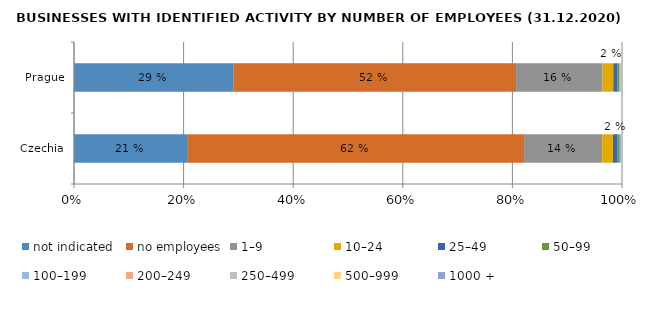
| Category | not indicated | no employees | 1–9 | 10–24 | 25–49 | 50–99 | 100–199 | 200–249 | 250–499 | 500–999 | 1000 + |
|---|---|---|---|---|---|---|---|---|---|---|---|
| Czechia | 20.635 | 61.5 | 14.255 | 1.962 | 0.78 | 0.469 | 0.213 | 0.039 | 0.082 | 0.038 | 0.027 |
| Prague | 29.143 | 51.531 | 15.777 | 1.959 | 0.714 | 0.427 | 0.225 | 0.042 | 0.091 | 0.046 | 0.044 |